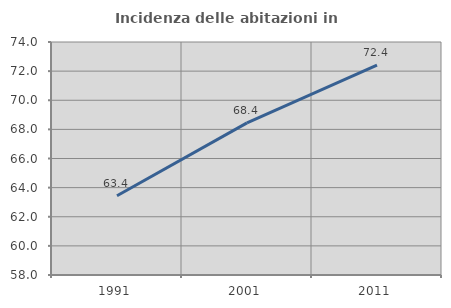
| Category | Incidenza delle abitazioni in proprietà  |
|---|---|
| 1991.0 | 63.444 |
| 2001.0 | 68.447 |
| 2011.0 | 72.415 |